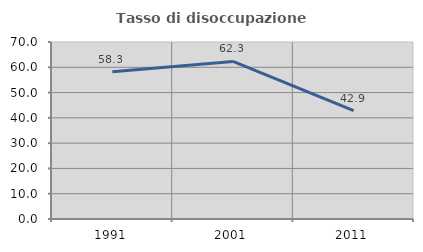
| Category | Tasso di disoccupazione giovanile  |
|---|---|
| 1991.0 | 58.252 |
| 2001.0 | 62.295 |
| 2011.0 | 42.857 |